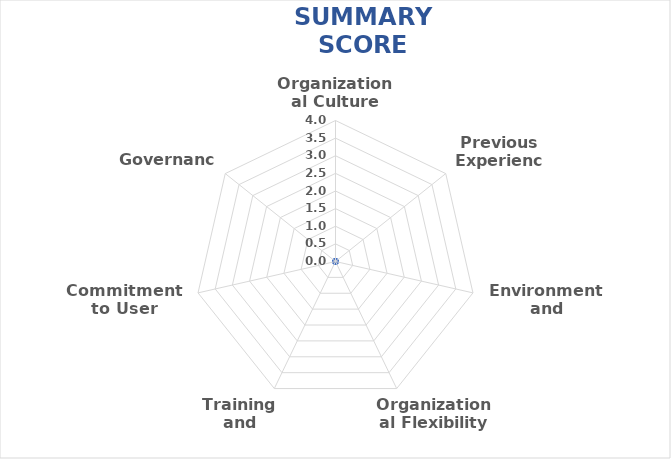
| Category | SUMMARY |
|---|---|
| Organizational Culture | 0 |
| Previous Experience | 0 |
| Environment and Technology | 0 |
| Organizational Flexibility | 0 |
| Training and Assistance | 0 |
| Commitment to User Research | 0 |
| Governance | 0 |